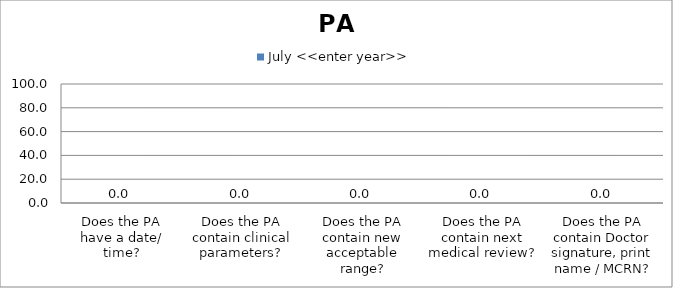
| Category | July <<enter year>> |
|---|---|
| Does the PA have a date/ time? | 0 |
| Does the PA contain clinical parameters? | 0 |
| Does the PA contain new acceptable range? | 0 |
| Does the PA contain next medical review? | 0 |
| Does the PA contain Doctor signature, print name / MCRN? | 0 |